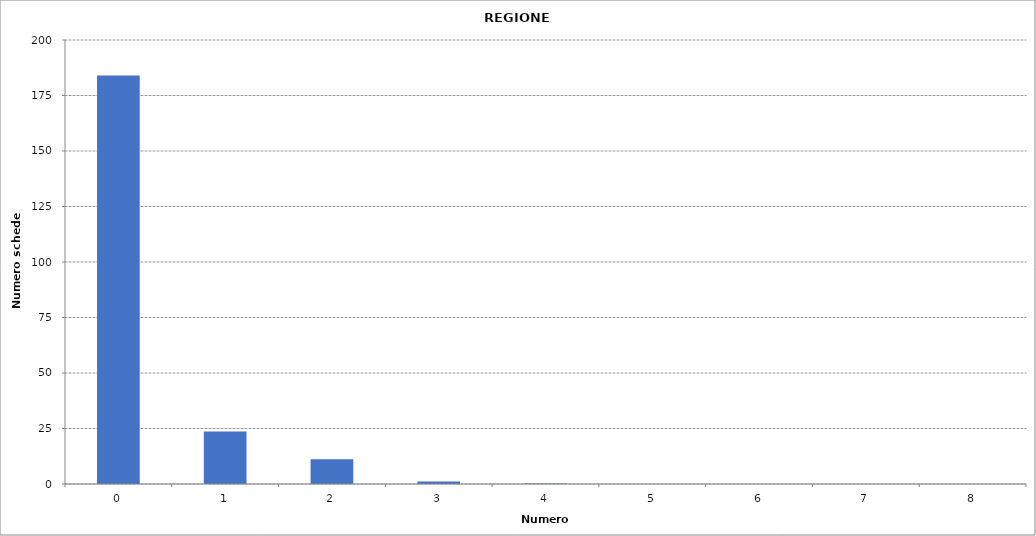
| Category | Series 0 |
|---|---|
| 0.0 | 184031 |
| 1.0 | 23648 |
| 2.0 | 11196 |
| 3.0 | 1073 |
| 4.0 | 191 |
| 5.0 | 27 |
| 6.0 | 11 |
| 7.0 | 1 |
| 8.0 | 3 |